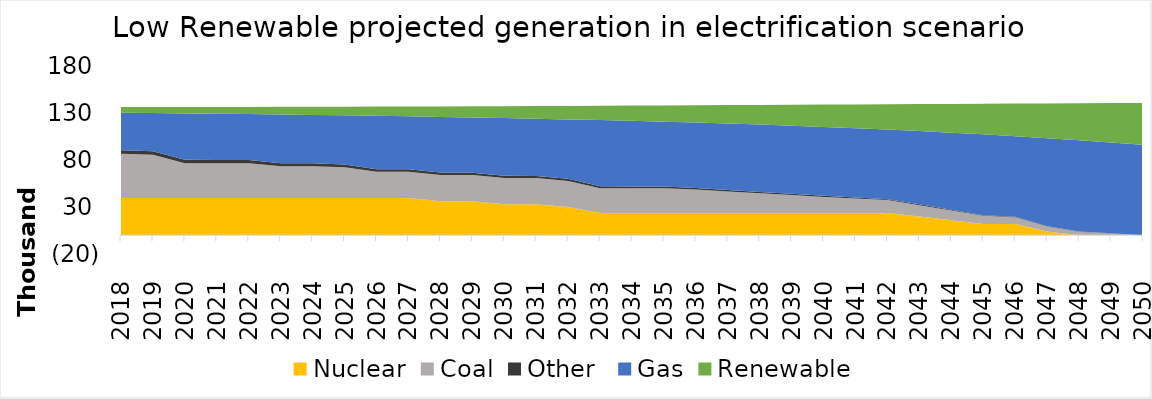
| Category | Nuclear | Coal | Other  | Gas | Renewable |
|---|---|---|---|---|---|
| 2018.0 | 39619.615 | 46981.414 | 3823.479 | 39909.675 | 5975.456 |
| 2019.0 | 39619.615 | 46088.838 | 3703.996 | 40540.354 | 6356.838 |
| 2020.0 | 39619.615 | 37025.025 | 3584.512 | 49317.928 | 6762.56 |
| 2021.0 | 39619.615 | 37025.025 | 3467.273 | 49087.215 | 7198.84 |
| 2022.0 | 39619.615 | 37025.025 | 3349.88 | 48828.514 | 7663.262 |
| 2023.0 | 39619.615 | 33742.025 | 3232.332 | 51823.009 | 8157.643 |
| 2024.0 | 39619.615 | 33742.025 | 3114.629 | 51502.769 | 8683.913 |
| 2025.0 | 39619.615 | 32618.344 | 2996.771 | 52272.417 | 9244.132 |
| 2026.0 | 39619.615 | 27782.455 | 2878.759 | 56718.292 | 9840.486 |
| 2027.0 | 39619.615 | 27782.455 | 2760.591 | 56289.965 | 10475.309 |
| 2028.0 | 36248.549 | 27782.455 | 2642.269 | 59191.91 | 11151.08 |
| 2029.0 | 36248.549 | 27782.455 | 2523.792 | 58679.354 | 11870.441 |
| 2030.0 | 32996.623 | 27782.455 | 2405.16 | 61372.477 | 12636.202 |
| 2031.0 | 32996.623 | 27782.455 | 2287.844 | 60842.639 | 13460.012 |
| 2032.0 | 29973.286 | 27782.455 | 2170.218 | 63282.763 | 14337.506 |
| 2033.0 | 23723.063 | 26185.776 | 2052.283 | 70489.581 | 15272.181 |
| 2034.0 | 23723.063 | 26185.776 | 1934.038 | 69788.901 | 16267.762 |
| 2035.0 | 23723.063 | 26185.776 | 1815.483 | 69023.658 | 17328.215 |
| 2036.0 | 23723.063 | 24823.423 | 1696.619 | 69551.98 | 18457.767 |
| 2037.0 | 23723.063 | 22858.569 | 1577.445 | 70609.513 | 19660.916 |
| 2038.0 | 23723.063 | 20888.619 | 1457.961 | 71594.06 | 20942.458 |
| 2039.0 | 23723.063 | 18913.574 | 1338.168 | 72500.516 | 22307.497 |
| 2040.0 | 23723.063 | 16933.432 | 1218.065 | 73323.441 | 23761.472 |
| 2041.0 | 23723.063 | 15304.808 | 1097.652 | 73700.432 | 25310.174 |
| 2042.0 | 23723.063 | 13671.994 | 976.929 | 73981.026 | 26959.772 |
| 2043.0 | 19958.228 | 12034.99 | 855.897 | 77923.488 | 28716.837 |
| 2044.0 | 15909.88 | 10393.795 | 734.555 | 82039.498 | 30588.367 |
| 2045.0 | 11924.13 | 8748.41 | 612.904 | 85975.49 | 32581.816 |
| 2046.0 | 11924.13 | 7098.835 | 490.942 | 85800.375 | 34705.123 |
| 2047.0 | 3840.358 | 5445.069 | 368.671 | 93575.219 | 36966.744 |
| 2048.0 | 0 | 3787.113 | 246.091 | 96963.827 | 39375.685 |
| 2049.0 | 0 | 1895.94 | 123.2 | 96588.693 | 41941.539 |
| 2050.0 | 0 | 0 | 0 | 96051.506 | 44674.522 |